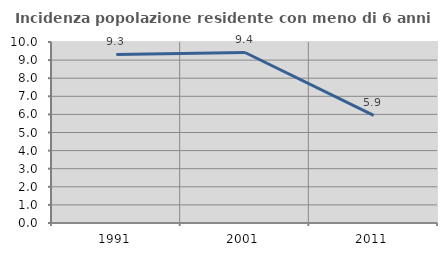
| Category | Incidenza popolazione residente con meno di 6 anni |
|---|---|
| 1991.0 | 9.311 |
| 2001.0 | 9.421 |
| 2011.0 | 5.941 |